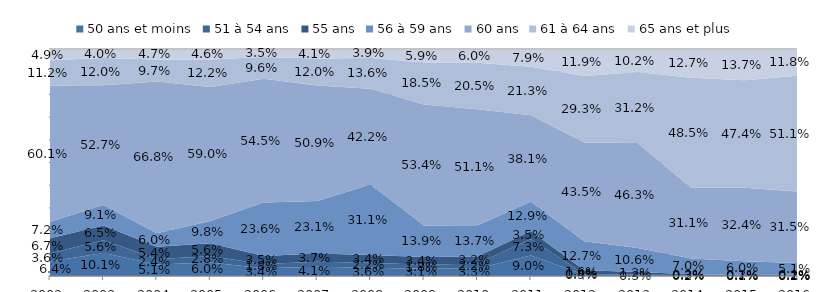
| Category | 50 ans et moins | 51 à 54 ans | 55 ans | 56 à 59 ans | 60 ans | 61 à 64 ans | 65 ans et plus |
|---|---|---|---|---|---|---|---|
| 2002.0 | 0.064 | 0.036 | 0.067 | 0.072 | 0.601 | 0.112 | 0.049 |
| 2003.0 | 0.101 | 0.056 | 0.065 | 0.091 | 0.527 | 0.12 | 0.04 |
| 2004.0 | 0.051 | 0.024 | 0.054 | 0.06 | 0.668 | 0.097 | 0.047 |
| 2005.0 | 0.06 | 0.028 | 0.056 | 0.098 | 0.59 | 0.122 | 0.046 |
| 2006.0 | 0.034 | 0.018 | 0.035 | 0.236 | 0.545 | 0.096 | 0.035 |
| 2007.0 | 0.041 | 0.022 | 0.037 | 0.231 | 0.509 | 0.12 | 0.041 |
| 2008.0 | 0.036 | 0.022 | 0.034 | 0.311 | 0.422 | 0.136 | 0.039 |
| 2009.0 | 0.031 | 0.018 | 0.034 | 0.139 | 0.534 | 0.185 | 0.059 |
| 2010.0 | 0.033 | 0.022 | 0.032 | 0.137 | 0.511 | 0.205 | 0.06 |
| 2011.0 | 0.09 | 0.073 | 0.035 | 0.129 | 0.381 | 0.213 | 0.079 |
| 2012.0 | 0.005 | 0.004 | 0.016 | 0.127 | 0.435 | 0.293 | 0.119 |
| 2013.0 | 0.003 | 0.002 | 0.012 | 0.106 | 0.463 | 0.312 | 0.102 |
| 2014.0 | 0.002 | 0.003 | 0.003 | 0.07 | 0.311 | 0.485 | 0.127 |
| 2015.0 | 0.001 | 0.001 | 0.002 | 0.06 | 0.324 | 0.474 | 0.137 |
| 2016.0 | 0.001 | 0.002 | 0.002 | 0.051 | 0.315 | 0.511 | 0.118 |